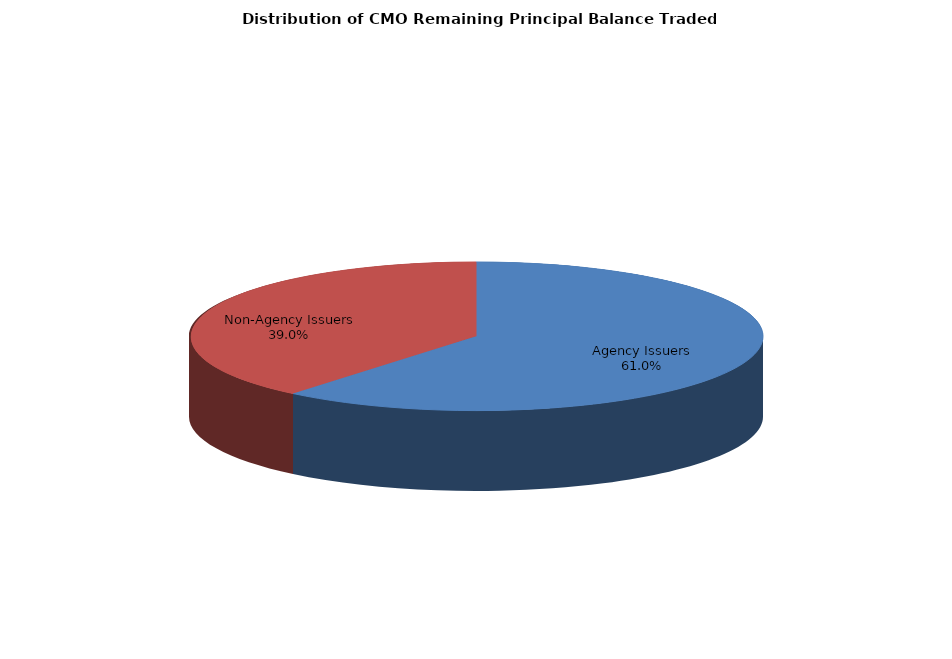
| Category | Series 0 |
|---|---|
| Agency Issuers | 3975592505.196 |
| Non-Agency Issuers | 2541433647.805 |